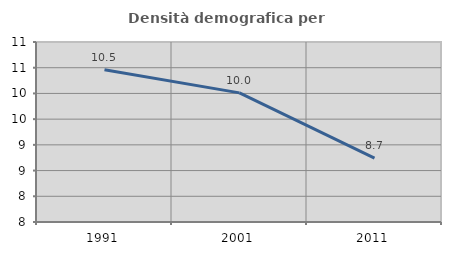
| Category | Densità demografica |
|---|---|
| 1991.0 | 10.459 |
| 2001.0 | 10.01 |
| 2011.0 | 8.74 |